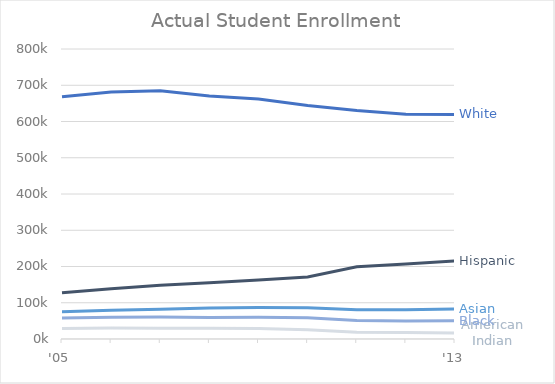
| Category | Series 0 | Series 1 | Series 2 | Series 3 | Series 4 |
|---|---|---|---|---|---|
| '05 | 127281.66 | 28927.65 | 75211.89 | 57855.3 | 668228.715 |
|  | 138457.47 | 30099.45 | 79261.885 | 60198.9 | 681250.885 |
|  | 148257.36 | 29857.385 | 82365.2 | 60744.335 | 684660.725 |
|  | 155204.293 | 29807.447 | 85310.969 | 59614.894 | 670153.636 |
|  | 162875.254 | 29047.816 | 87143.448 | 60170.476 | 661875.236 |
|  | 171314.278 | 25645.85 | 86170.056 | 58472.538 | 644223.752 |
|  | 199025.28 | 18658.62 | 80854.02 | 50792.91 | 630246.72 |
|  | 206652.943 | 17653.769 | 80999.646 | 49845.936 | 619958.829 |
| '13 | 215570.825 | 16825.04 | 83073.635 | 50475.12 | 619371.785 |